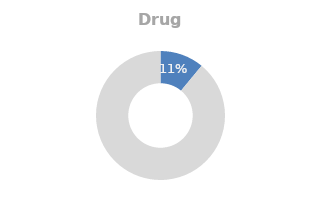
| Category | Drug use |
|---|---|
| 0 | 0.11 |
| 1 | 0.89 |